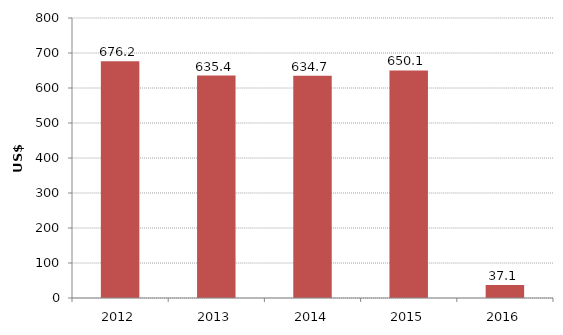
| Category | US$ m. |
|---|---|
| 2012.0 | 676.239 |
| 2013.0 | 635.378 |
| 2014.0 | 634.663 |
| 2015.0 | 650.082 |
| 2016.0 | 37.096 |